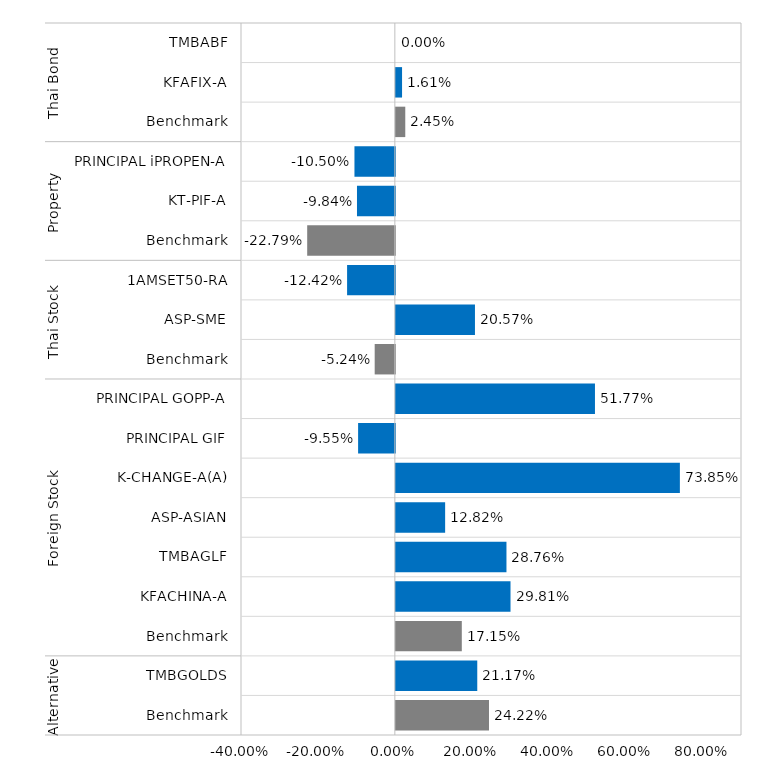
| Category | Series 0 |
|---|---|
| 0 | 0 |
| 1 | 0.016 |
| 2 | 0.025 |
| 3 | -0.105 |
| 4 | -0.098 |
| 5 | -0.228 |
| 6 | -0.124 |
| 7 | 0.206 |
| 8 | -0.052 |
| 9 | 0.518 |
| 10 | -0.096 |
| 11 | 0.738 |
| 12 | 0.128 |
| 13 | 0.288 |
| 14 | 0.298 |
| 15 | 0.171 |
| 16 | 0.212 |
| 17 | 0.242 |